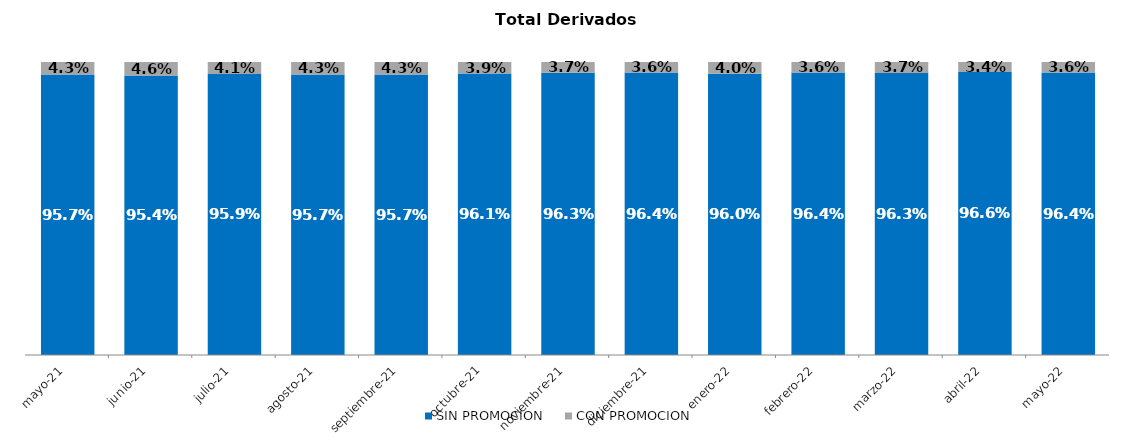
| Category | SIN PROMOCION   | CON PROMOCION   |
|---|---|---|
| 2021-05-01 | 0.957 | 0.043 |
| 2021-06-01 | 0.954 | 0.046 |
| 2021-07-01 | 0.959 | 0.041 |
| 2021-08-01 | 0.957 | 0.043 |
| 2021-09-01 | 0.957 | 0.043 |
| 2021-10-01 | 0.961 | 0.039 |
| 2021-11-01 | 0.963 | 0.037 |
| 2021-12-01 | 0.964 | 0.036 |
| 2022-01-01 | 0.96 | 0.04 |
| 2022-02-01 | 0.964 | 0.036 |
| 2022-03-01 | 0.963 | 0.037 |
| 2022-04-01 | 0.966 | 0.034 |
| 2022-05-01 | 0.964 | 0.036 |